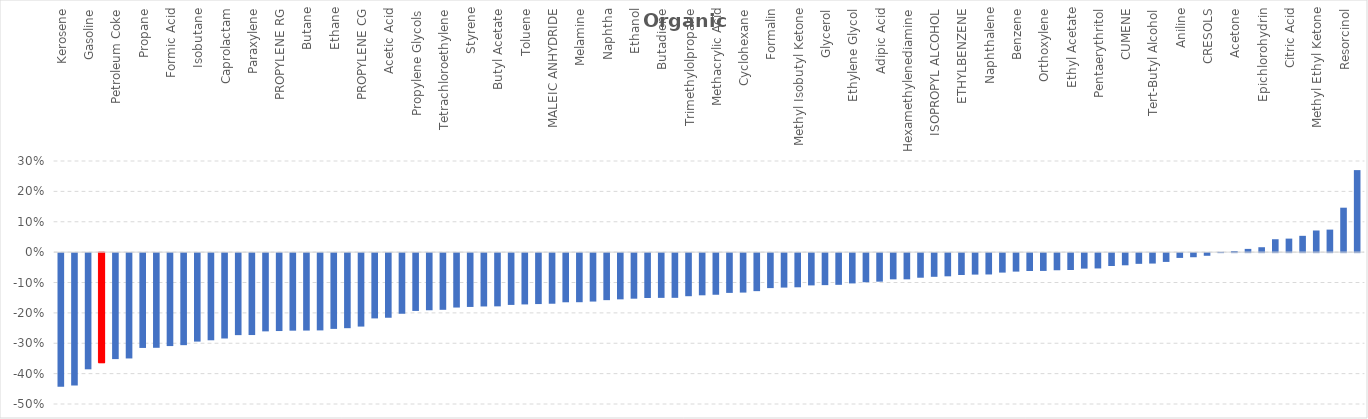
| Category | Series 0 |
|---|---|
| Kerosene | -0.44 |
| Fuel Oil | -0.436 |
| Gasoline | -0.383 |
| Crude Oil | -0.362 |
| Petroleum Coke | -0.349 |
| Acrylonitrile | -0.347 |
| Propane | -0.312 |
| Petroleum Pitch | -0.312 |
| Formic Acid | -0.306 |
| Ethylene Dichloride | -0.303 |
| Isobutane | -0.291 |
| Xylenes | -0.287 |
| Caprolactam | -0.281 |
| Butanol | -0.27 |
| Paraxylene | -0.27 |
| Natural Gas | -0.258 |
| PROPYLENE RG | -0.257 |
| Pyridine | -0.255 |
| Butane | -0.255 |
| Methylene Chloride | -0.254 |
| Ethane | -0.249 |
| PROPYLENE PG | -0.247 |
| PROPYLENE CG | -0.242 |
| Ethylhexanol | -0.215 |
| Acetic Acid | -0.213 |
| Dimethyl Terephthalate | -0.2 |
| Propylene Glycols | -0.19 |
| Methanol | -0.188 |
| Tetrachloroethylene | -0.187 |
| Propylene Oxide | -0.179 |
| Styrene | -0.177 |
| Phenol | -0.176 |
| Butyl Acetate | -0.175 |
| Isoprene | -0.171 |
| Toluene | -0.169 |
| Acrylic Acid | -0.168 |
| MALEIC ANHYDRIDE | -0.167 |
| Phthalic Anhydride | -0.162 |
| Melamine | -0.162 |
| TEREPHTHALIC ACID | -0.159 |
| Naphtha | -0.155 |
| Tetrahydrofuran | -0.152 |
| Ethanol | -0.15 |
| Diesel | -0.148 |
| Butadiene | -0.147 |
| Methyl Acrylate | -0.147 |
| Trimethylolpropane | -0.142 |
| Diethylene Glycol | -0.139 |
| Methacrylic Acid | -0.137 |
| Dioctyl Phthalate | -0.131 |
| Cyclohexane | -0.13 |
| Chlorobenzene | -0.125 |
| Formalin | -0.115 |
| Bisphenol A | -0.113 |
| Methyl Isobutyl Ketone | -0.112 |
| Anthraquinone | -0.106 |
| Glycerol | -0.105 |
| Diethanolamine | -0.104 |
| Ethylene Glycol | -0.1 |
| Vinyl Acetate | -0.096 |
| Adipic Acid | -0.094 |
| Vinyl Chloride | -0.086 |
| Hexamethylenediamine | -0.086 |
| Benzyl Alcohol | -0.081 |
| ISOPROPYL ALCOHOL | -0.078 |
| Paraffin Wax | -0.076 |
| ETHYLBENZENE | -0.072 |
| Monoethanolamine | -0.071 |
| Naphthalene | -0.07 |
| Ethylene | -0.064 |
| Benzene | -0.061 |
| Petroleum Jelly | -0.059 |
| Orthoxylene | -0.059 |
| Ethylvanillin | -0.056 |
| Ethyl Acetate | -0.056 |
| Methyl Chloride | -0.051 |
| Pentaerythritol | -0.05 |
| Cyclohexanone | -0.042 |
| CUMENE | -0.04 |
| Acetic Anhydride | -0.035 |
| Tert-Butyl Alcohol | -0.034 |
| ETHYLENE OXIDE | -0.029 |
| Aniline | -0.016 |
| Carbon Black  | -0.014 |
| CRESOLS | -0.009 |
| Butene | 0.001 |
| Acetone | 0.004 |
| Chloroform | 0.011 |
| Epichlorohydrin | 0.016 |
| Oxalic Acid | 0.042 |
| Citric Acid | 0.044 |
| Carboxymethyl Cellulose | 0.054 |
| Methyl Ethyl Ketone | 0.071 |
| Trichloroethylene | 0.074 |
| Resorcinol | 0.146 |
| Diethyl Ether | 0.27 |